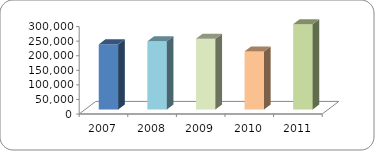
| Category | PERSONAS CAPACITADAS |
|---|---|
| 2007.0 | 223544 |
| 2008.0 | 233903 |
| 2009.0 | 242874 |
| 2010.0 | 199329 |
| 2011.0 | 292866 |